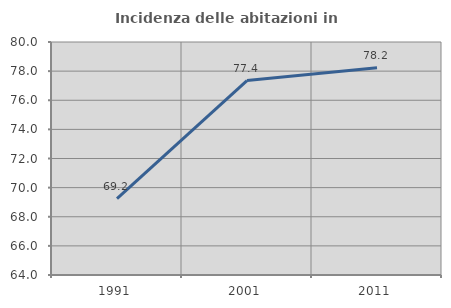
| Category | Incidenza delle abitazioni in proprietà  |
|---|---|
| 1991.0 | 69.247 |
| 2001.0 | 77.351 |
| 2011.0 | 78.237 |